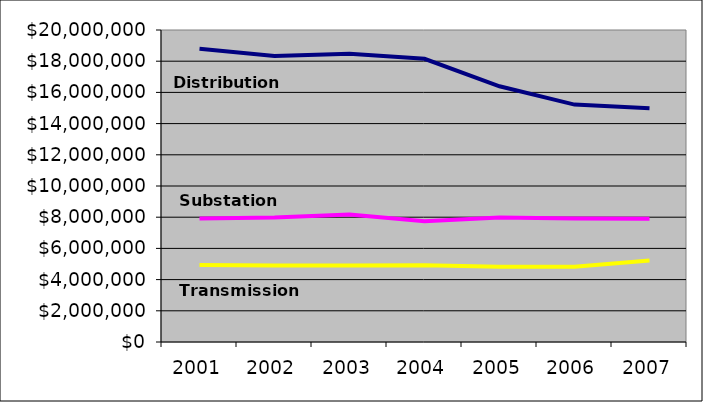
| Category | Aggregate Distribution Depreciation | Aggregate Substation Depreciation | Aggregate Transmission Depreciation |
|---|---|---|---|
| 2001.0 | 18803355.73 | 7922499.991 | 4942006.339 |
| 2002.0 | 18334809.032 | 7985344.534 | 4898599.575 |
| 2003.0 | 18482653.543 | 8169483.68 | 4897288.689 |
| 2004.0 | 18151867.435 | 7738355.645 | 4919240.465 |
| 2005.0 | 16390580.83 | 7987657.382 | 4817626.04 |
| 2006.0 | 15216754.037 | 7923410.852 | 4827446.73 |
| 2007.0 | 14987162.28 | 7896854.303 | 5225492.807 |